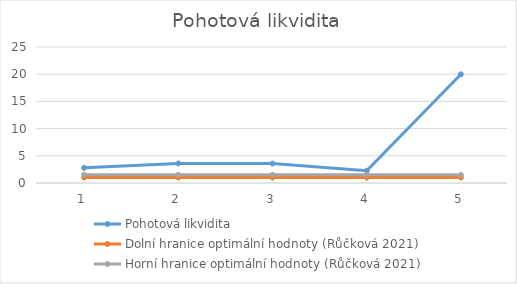
| Category | Pohotová likvidita | Dolní hranice optimální hodnoty (Růčková 2021) | Horní hranice optimální hodnoty (Růčková 2021) |
|---|---|---|---|
| 0 | 2.788 | 1 | 1.5 |
| 1 | 3.597 | 1 | 1.5 |
| 2 | 3.574 | 1 | 1.5 |
| 3 | 2.241 | 1 | 1.5 |
| 4 | 19.983 | 1 | 1.5 |